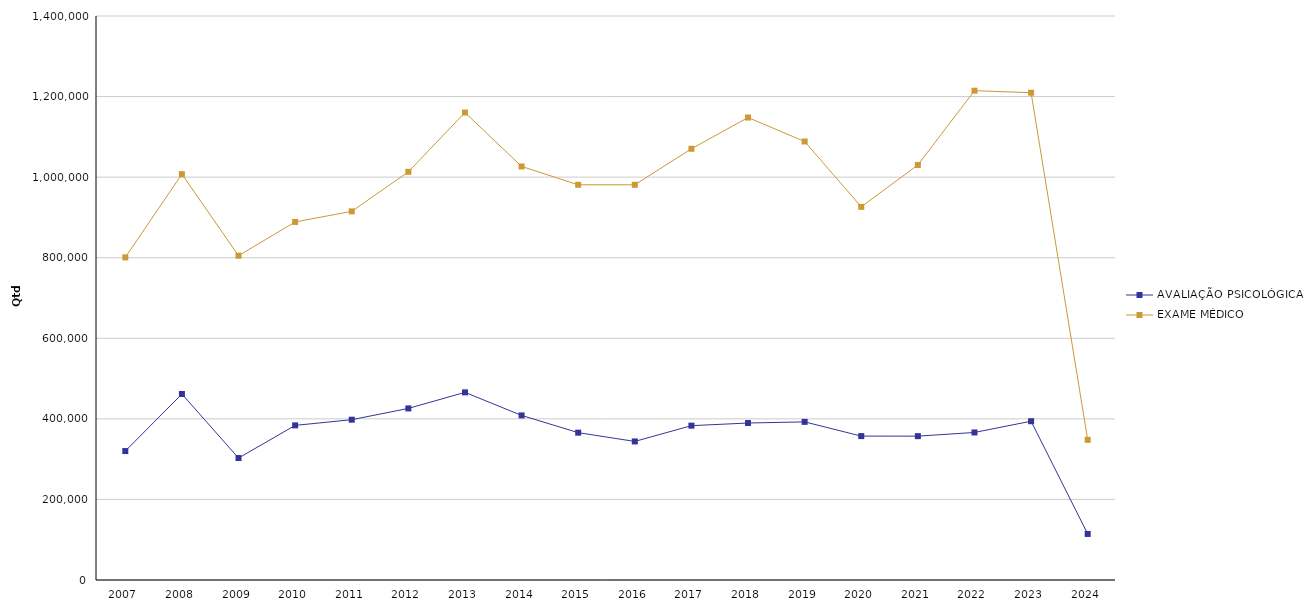
| Category | AVALIAÇÃO PSICOLÓGICA | EXAME MÉDICO |
|---|---|---|
| 2007 | 320087 | 800805 |
| 2008 | 461684 | 1007421 |
| 2009 | 302733 | 805060 |
| 2010 | 383818 | 888764 |
| 2011 | 397914 | 915124 |
| 2012 | 425904 | 1013188 |
| 2013 | 465777 | 1160399 |
| 2014 | 408529 | 1026576 |
| 2015 | 365747 | 981036 |
| 2016 | 343972 | 981030 |
| 2017 | 383105 | 1070389 |
| 2018 | 389671 | 1147939 |
| 2019 | 392530 | 1088505 |
| 2020 | 357213 | 926285 |
| 2021 | 357077 | 1030223 |
| 2022 | 366233 | 1214613 |
| 2023 | 394143 | 1209593 |
| 2024 | 114317 | 347938 |